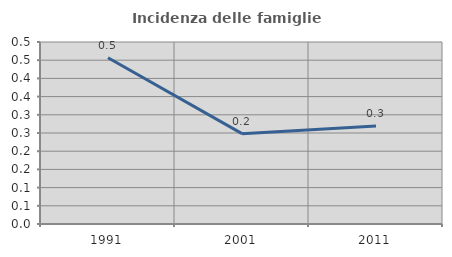
| Category | Incidenza delle famiglie numerose |
|---|---|
| 1991.0 | 0.457 |
| 2001.0 | 0.248 |
| 2011.0 | 0.27 |